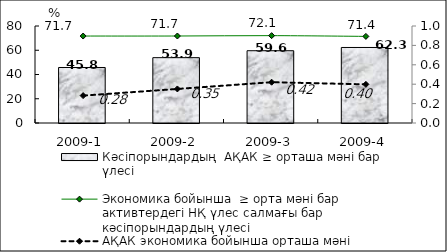
| Category | Кәсіпорындардың  АҚАК ≥ орташа мәні бар үлесі  |
|---|---|
| 2009-1 | 45.78 |
| 2009-2 | 53.89 |
| 2009-3 | 59.61 |
| 2009-4 | 62.29 |